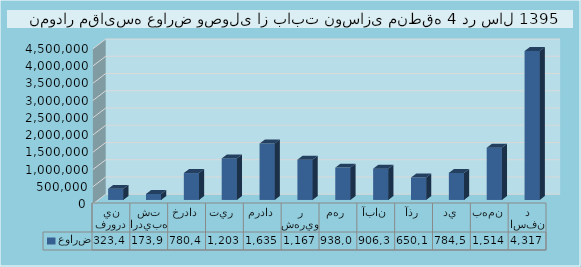
| Category | عوارض |
|---|---|
| فروردين | 323411 |
| ارديبهشت | 173956 |
| خرداد | 780483 |
| تير  | 1203884 |
| مرداد | 1635934 |
| شهريور | 1167726 |
| مهر  | 938084 |
| آبان | 906342 |
| آذر | 650128 |
| دي | 784554 |
| بهمن | 1514833 |
| اسفند | 4317869 |